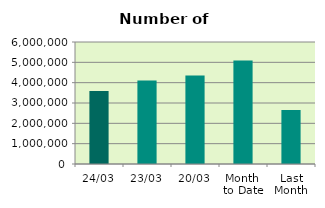
| Category | Series 0 |
|---|---|
| 24/03 | 3590194 |
| 23/03 | 4111934 |
| 20/03 | 4355904 |
| Month 
to Date | 5090254.471 |
| Last
Month | 2656039 |